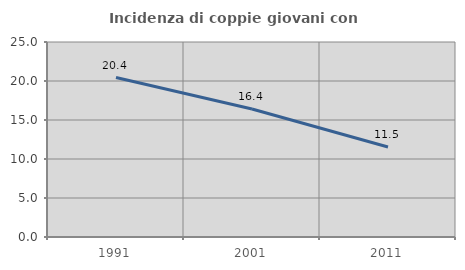
| Category | Incidenza di coppie giovani con figli |
|---|---|
| 1991.0 | 20.444 |
| 2001.0 | 16.416 |
| 2011.0 | 11.531 |